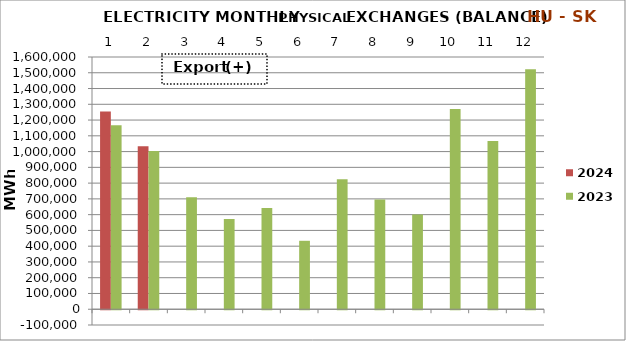
| Category | 2024 | 2023 |
|---|---|---|
| 0 | 1254127.676 | 1166585.06 |
| 1 | 1034499.705 | 1004039.276 |
| 2 | 0 | 710374.65 |
| 3 | 0 | 572949.227 |
| 4 | 0 | 641721.635 |
| 5 | 0 | 434167.914 |
| 6 | 0 | 825008.214 |
| 7 | 0 | 695909.153 |
| 8 | 0 | 600140.25 |
| 9 | 0 | 1269476.064 |
| 10 | 0 | 1067741.083 |
| 11 | 0 | 1522866.782 |